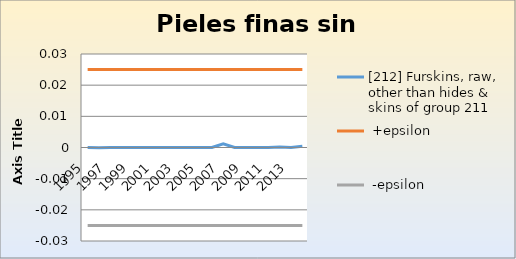
| Category | [212] Furskins, raw, other than hides & skins of group 211 |  +epsilon |  -epsilon |
|---|---|---|---|
| 1995.0 | 0 | 0.025 | -0.025 |
| 1996.0 | 0 | 0.025 | -0.025 |
| 1997.0 | 0 | 0.025 | -0.025 |
| 1998.0 | 0 | 0.025 | -0.025 |
| 1999.0 | 0 | 0.025 | -0.025 |
| 2000.0 | 0 | 0.025 | -0.025 |
| 2001.0 | 0 | 0.025 | -0.025 |
| 2002.0 | 0 | 0.025 | -0.025 |
| 2003.0 | 0 | 0.025 | -0.025 |
| 2004.0 | 0 | 0.025 | -0.025 |
| 2005.0 | 0 | 0.025 | -0.025 |
| 2006.0 | 0 | 0.025 | -0.025 |
| 2007.0 | 0.001 | 0.025 | -0.025 |
| 2008.0 | 0 | 0.025 | -0.025 |
| 2009.0 | 0 | 0.025 | -0.025 |
| 2010.0 | 0 | 0.025 | -0.025 |
| 2011.0 | 0 | 0.025 | -0.025 |
| 2012.0 | 0 | 0.025 | -0.025 |
| 2013.0 | 0 | 0.025 | -0.025 |
| 2014.0 | 0 | 0.025 | -0.025 |